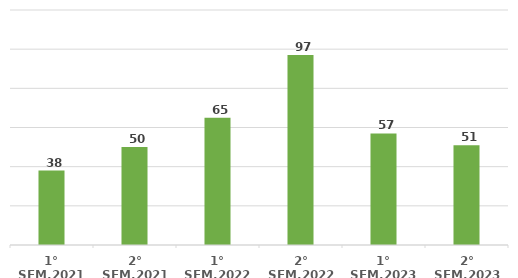
| Category | Cronograma |
|---|---|
| 1° SEM.2021 | 38 |
| 2° SEM.2021 | 50 |
| 1° SEM.2022 | 65 |
| 2° SEM.2022 | 97 |
| 1° SEM.2023 | 57 |
| 2° SEM.2023 | 51 |